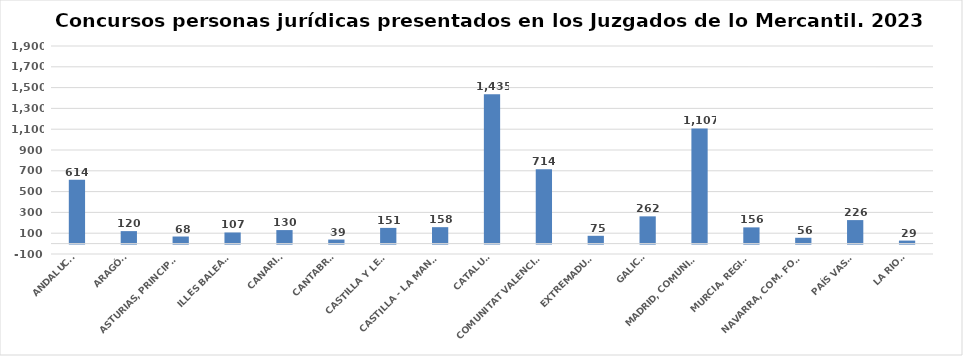
| Category | Series 0 |
|---|---|
| ANDALUCÍA | 614 |
| ARAGÓN | 120 |
| ASTURIAS, PRINCIPADO | 68 |
| ILLES BALEARS | 107 |
| CANARIAS | 130 |
| CANTABRIA | 39 |
| CASTILLA Y LEÓN | 151 |
| CASTILLA - LA MANCHA | 158 |
| CATALUÑA | 1435 |
| COMUNITAT VALENCIANA | 714 |
| EXTREMADURA | 75 |
| GALICIA | 262 |
| MADRID, COMUNIDAD | 1107 |
| MURCIA, REGIÓN | 156 |
| NAVARRA, COM. FORAL | 56 |
| PAÍS VASCO | 226 |
| LA RIOJA | 29 |